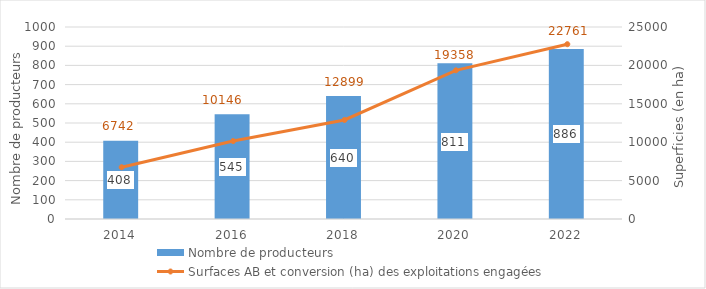
| Category | Nombre de producteurs |
|---|---|
| 2014.0 | 408 |
| 2016.0 | 545 |
| 2018.0 | 640 |
| 2020.0 | 811 |
| 2022.0 | 886 |